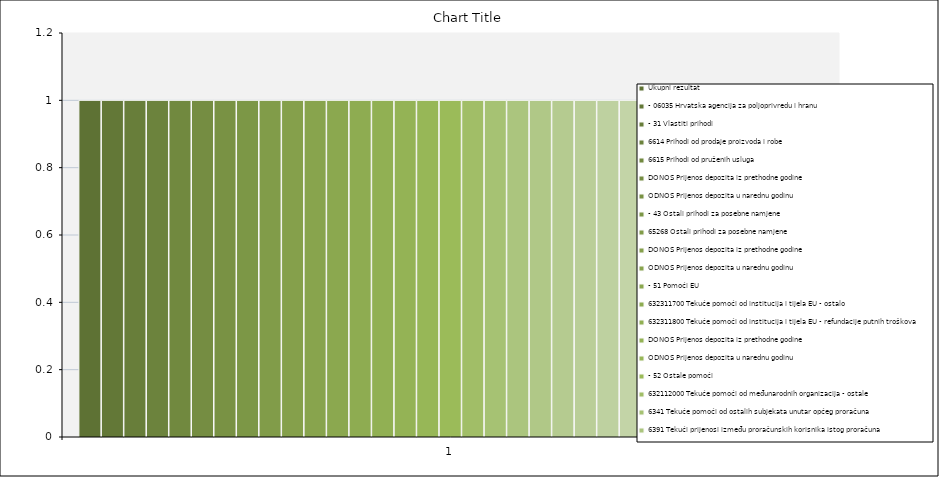
| Category | Ukupni rezultat | - 06035 Hrvatska agencija za poljoprivredu i hranu | - 31 Vlastiti prihodi | 6614 Prihodi od prodaje proizvoda i robe | 6615 Prihodi od pruženih usluga | DONOS Prijenos depozita iz prethodne godine | ODNOS Prijenos depozita u narednu godinu | - 43 Ostali prihodi za posebne namjene | 65268 Ostali prihodi za posebne namjene | - 51 Pomoći EU | 632311700 Tekuće pomoći od institucija i tijela EU - ostalo | 632311800 Tekuće pomoći od institucija i tijela EU - refundacije putnih troškova | - 52 Ostale pomoći | 632112000 Tekuće pomoći od međunarodnih organizacija - ostale | 6341 Tekuće pomoći od ostalih subjekata unutar općeg proračuna | 6391 Tekući prijenosi između proračunskih korisnika istog proračuna | 6393 Tekući prijenosi između proračunskih korisnika istog proračuna temeljem prijenosa EU sredstava | 6394 Kapitalni prijenosi između proračunskih korisnika istog proračuna temeljem prijenosa EU sredstava | - 559 Ostale refundacije iz sredstava EU | 632310559 Tekuće pomoći od institucija i tijela EU – ostale refundacije | - 563 Europski fond za regionalni razvoj (EFRR | 632310563 Tekuće pomoći od institucija i tijela EU - EFRR | - 581 Mehanizam za oporavak i otpornost | 632310581 Tek.pom.od instit. tijela EU - Mehanizam za oporavak i otpornost | - 71 Prihodi od nefin. imovine i nadoknade št |
|---|---|---|---|---|---|---|---|---|---|---|---|---|---|---|---|---|---|---|---|---|---|---|---|---|---|
| 0 | 1 | 1 | 1 | 1 | 1 | 1 | 1 | 1 | 1 | 1 | 1 | 1 | 1 | 1 | 1 | 1 | 1 | 1 | 1 | 1 | 1 | 1 | 1 | 1 | 1 |